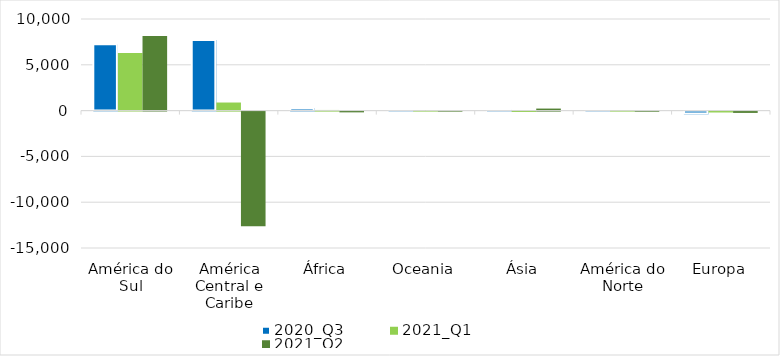
| Category | 2020_Q3 | 2021_Q1 | 2021_Q2 |
|---|---|---|---|
| América do Sul | 7248 | 6294 | 8134 |
| América Central e Caribe | 7719 | 882 | -12515 |
| África | 278 | 69 | -83 |
| Oceania | -4 | 7 | -3 |
| Ásia | 73 | -40 | 222 |
| América do Norte | 35 | 52 | -13 |
| Europa | -306 | -97 | -143 |